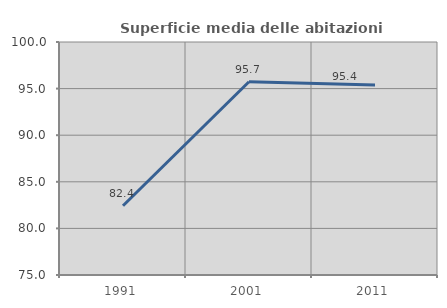
| Category | Superficie media delle abitazioni occupate |
|---|---|
| 1991.0 | 82.431 |
| 2001.0 | 95.738 |
| 2011.0 | 95.394 |